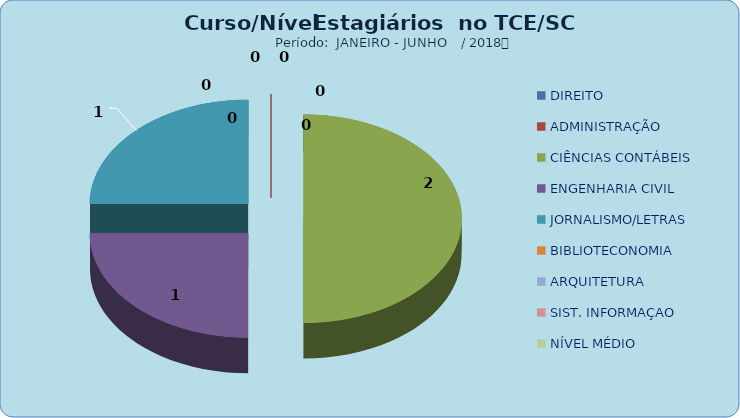
| Category | Series 0 |
|---|---|
| DIREITO | 0 |
| ADMINISTRAÇÃO | 0 |
| CIÊNCIAS CONTÁBEIS | 2 |
| ENGENHARIA CIVIL | 1 |
| JORNALISMO/LETRAS | 1 |
| BIBLIOTECONOMIA | 0 |
| ARQUITETURA | 0 |
| SIST. INFORMAÇAO | 0 |
| NÍVEL MÉDIO | 0 |